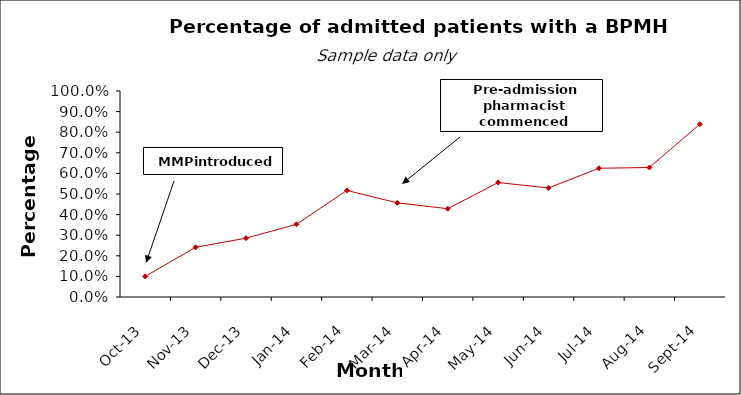
| Category | Series 0 |
|---|---|
| 2013-10-01 | 0.1 |
| 2013-11-01 | 0.241 |
| 2013-12-01 | 0.286 |
| 2014-01-01 | 0.353 |
| 2014-02-01 | 0.517 |
| 2014-03-01 | 0.457 |
| 2014-04-01 | 0.429 |
| 2014-05-01 | 0.556 |
| 2014-06-01 | 0.529 |
| 2014-07-01 | 0.625 |
| 2014-08-01 | 0.629 |
| 2014-09-01 | 0.839 |